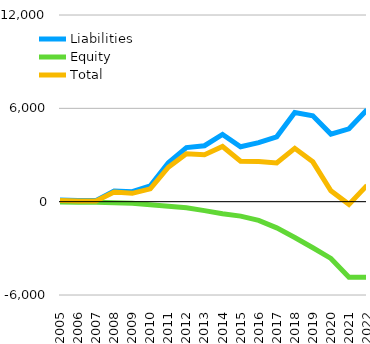
| Category | Liabilities  | Equity  | Total |
|---|---|---|---|
| 2005 | 100 | -19.16 | 80.84 |
| 2006 | 80 | -38.3 | 41.7 |
| 2007 | 80 | -38.3 | 41.7 |
| 2008 | 682.13 | -68.963 | 613.167 |
| 2009 | 642.091 | -107.253 | 534.838 |
| 2010 | 1016.547 | -191.911 | 824.636 |
| 2011 | 2506.252 | -291.566 | 2214.686 |
| 2012 | 3476.422 | -391.266 | 3085.156 |
| 2013 | 3595.472 | -573.976 | 3021.496 |
| 2014 | 4323.884 | -779.676 | 3544.208 |
| 2015 | 3528.318 | -928.771 | 2599.547 |
| 2016 | 3792.211 | -1203.691 | 2588.52 |
| 2017 | 4171.22 | -1684.74 | 2486.48 |
| 2018 | 5729.24 | -2301.289 | 3427.951 |
| 2019 | 5526.445 | -2963.943 | 2562.502 |
| 2020 | 4345.611 | -3648.955 | 696.656 |
| 2021 | 4681.611 | -4855.655 | -174.044 |
| 2022 | 5903.611 | -4855.655 | 1047.956 |